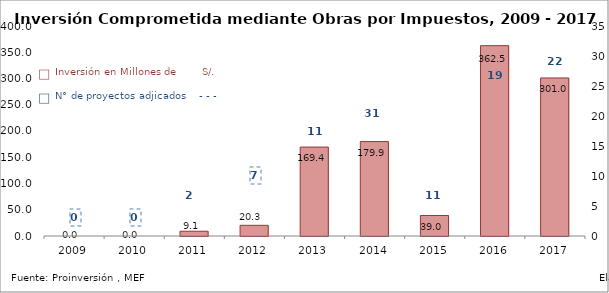
| Category | Inv. Total |
|---|---|
| 2009.0 | 0 |
| 2010.0 | 0 |
| 2011.0 | 9.059 |
| 2012.0 | 20.339 |
| 2013.0 | 169.387 |
| 2014.0 | 179.881 |
| 2015.0 | 39.026 |
| 2016.0 | 362.55 |
| 2017.0 | 301.03 |